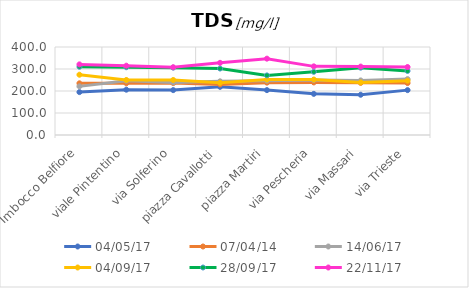
| Category | 04/05/17 | 07/04/14 | 14/06/17 | 04/09/17 | 28/09/17 | 22/11/17 |
|---|---|---|---|---|---|---|
| Imbocco Belfiore | 195 | 235 | 221 | 274 | 310 | 321 |
| viale Pintentino | 206 | 235 | 247 | 250 | 308 | 315 |
| via Solferino | 204 | 236 | 239 | 250 | 306 | 308 |
| piazza Cavallotti | 219 | 230 | 244 | 237 | 302 | 328 |
| piazza Martiri | 204 | 238 | 247 | 252 | 271 | 347 |
| via Pescheria | 187 | 239 | 250 | 252 | 287 | 312 |
| via Massari | 183 | 237 | 248 | 239 | 306 | 311 |
| via Trieste | 204 | 236 | 254 | 247 | 291 | 309 |